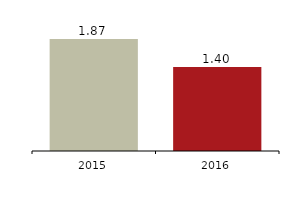
| Category | Earnings per share |
|---|---|
| 2016.0 | 1.401 |
| 2015.0 | 1.867 |